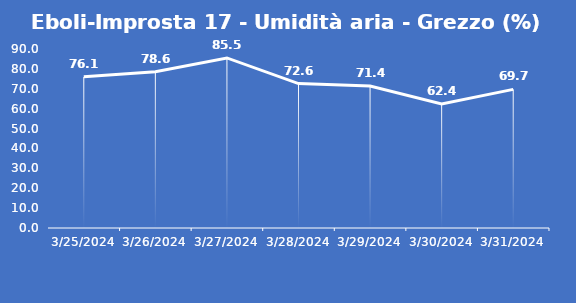
| Category | Eboli-Improsta 17 - Umidità aria - Grezzo (%) |
|---|---|
| 3/25/24 | 76.1 |
| 3/26/24 | 78.6 |
| 3/27/24 | 85.5 |
| 3/28/24 | 72.6 |
| 3/29/24 | 71.4 |
| 3/30/24 | 62.4 |
| 3/31/24 | 69.7 |